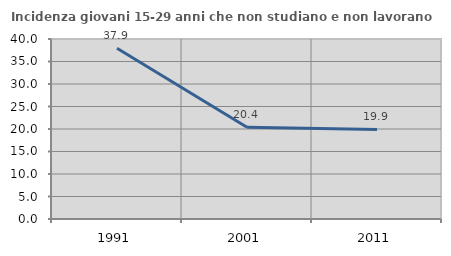
| Category | Incidenza giovani 15-29 anni che non studiano e non lavorano  |
|---|---|
| 1991.0 | 37.936 |
| 2001.0 | 20.388 |
| 2011.0 | 19.891 |